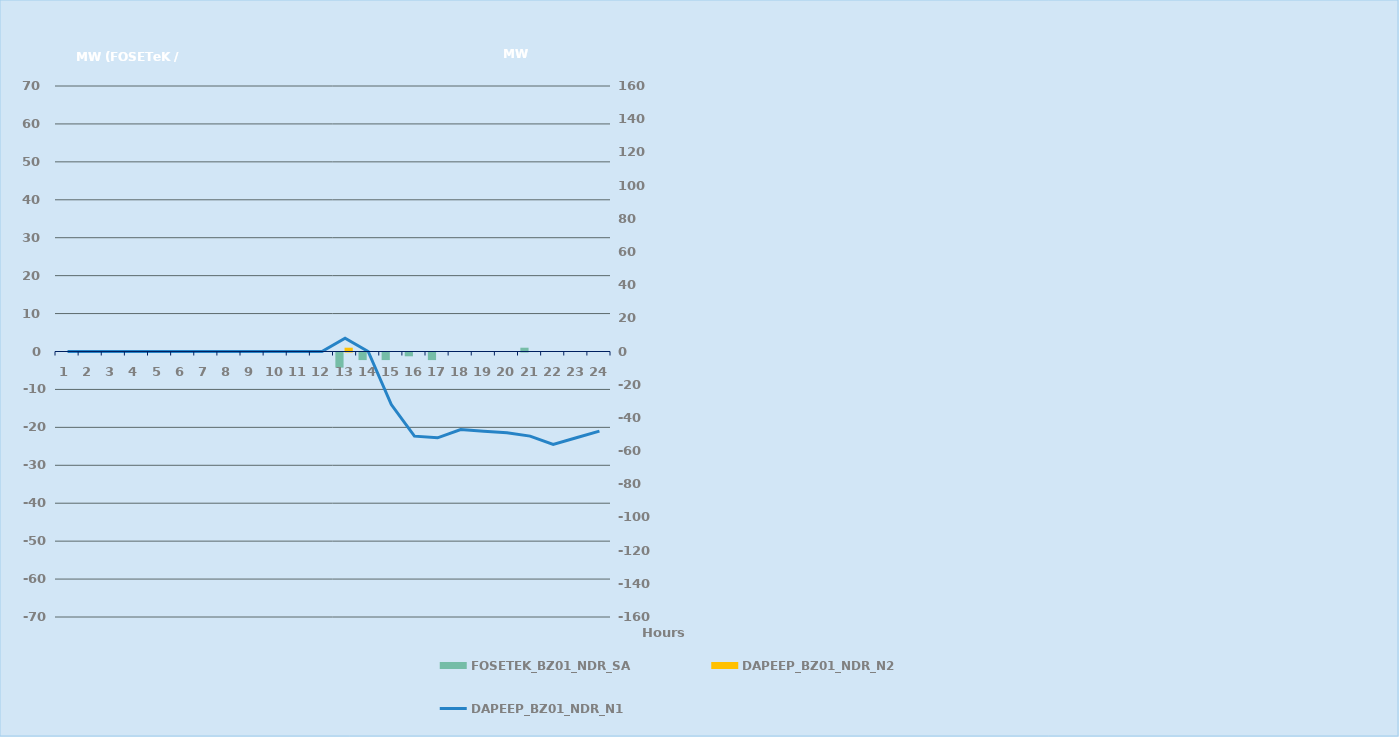
| Category | FOSETEK_BZ01_NDR_SA | DAPEEP_BZ01_NDR_N2 |
|---|---|---|
| 0 | 0 | 0 |
| 1 | 0 | 0 |
| 2 | 0 | 0 |
| 3 | 0 | 0 |
| 4 | 0 | 0 |
| 5 | 0 | 0 |
| 6 | 0 | 0 |
| 7 | 0 | 0 |
| 8 | 0 | 0 |
| 9 | 0 | 0 |
| 10 | 0 | 0 |
| 11 | 0 | 0 |
| 12 | -4 | 1 |
| 13 | -2 | 0 |
| 14 | -2 | 0 |
| 15 | -1 | 0 |
| 16 | -2 | 0 |
| 17 | 0 | 0 |
| 18 | 0 | 0 |
| 19 | 0 | 0 |
| 20 | 1 | 0 |
| 21 | 0 | 0 |
| 22 | 0 | 0 |
| 23 | 0 | 0 |